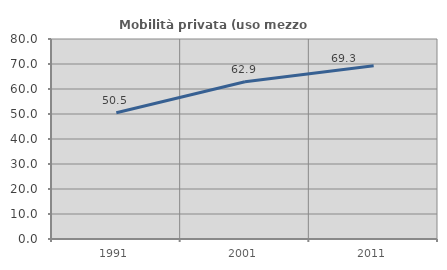
| Category | Mobilità privata (uso mezzo privato) |
|---|---|
| 1991.0 | 50.523 |
| 2001.0 | 62.9 |
| 2011.0 | 69.322 |